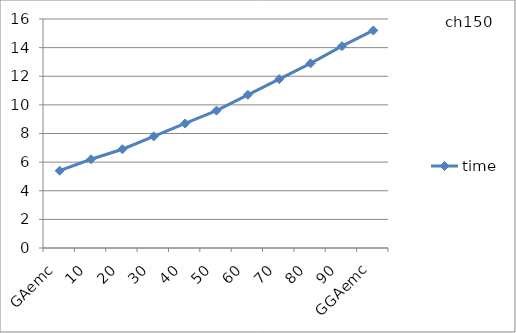
| Category | time |
|---|---|
| 0 | 5.4 |
| 1 | 6.2 |
| 2 | 6.9 |
| 3 | 7.8 |
| 4 | 8.7 |
| 5 | 9.6 |
| 6 | 10.7 |
| 7 | 11.8 |
| 8 | 12.9 |
| 9 | 14.1 |
| 10 | 15.2 |